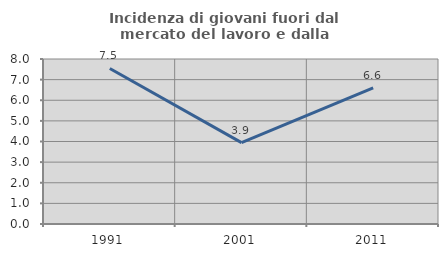
| Category | Incidenza di giovani fuori dal mercato del lavoro e dalla formazione  |
|---|---|
| 1991.0 | 7.541 |
| 2001.0 | 3.947 |
| 2011.0 | 6.602 |